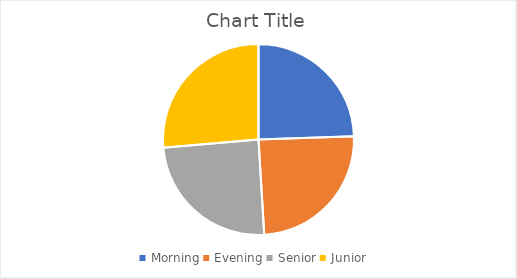
| Category | Series 0 |
|---|---|
| Morning | 368 |
| Evening | 370 |
| Senior | 370 |
| Junior | 397 |